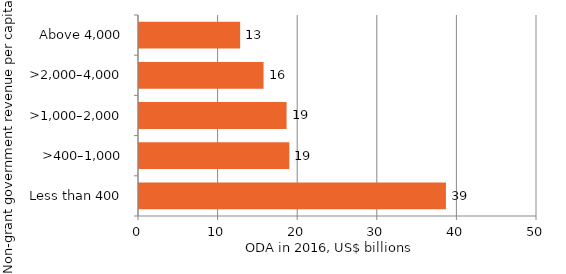
| Category | Series 0 |
|---|---|
| Less than 400 | 38558.077 |
| >400–1,000 | 18884.737 |
| >1,000–2,000 | 18539.59 |
| >2,000–4,000 | 15647.991 |
| Above 4,000 | 12705.583 |